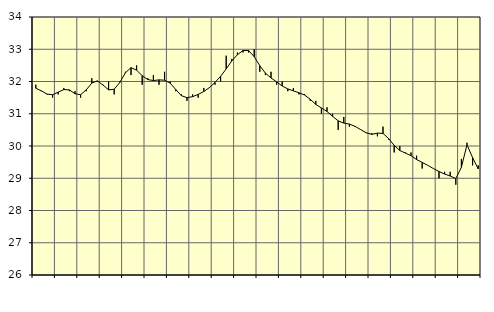
| Category | Piggar | Series 1 |
|---|---|---|
| nan | 31.9 | 31.79 |
| 1.0 | 31.7 | 31.71 |
| 1.0 | 31.6 | 31.61 |
| 1.0 | 31.5 | 31.59 |
| nan | 31.6 | 31.67 |
| 2.0 | 31.8 | 31.75 |
| 2.0 | 31.7 | 31.74 |
| 2.0 | 31.7 | 31.62 |
| nan | 31.5 | 31.59 |
| 3.0 | 31.7 | 31.74 |
| 3.0 | 32.1 | 31.95 |
| 3.0 | 32 | 32.02 |
| nan | 31.9 | 31.89 |
| 4.0 | 32 | 31.74 |
| 4.0 | 31.6 | 31.76 |
| 4.0 | 32 | 31.97 |
| nan | 32.3 | 32.27 |
| 5.0 | 32.2 | 32.43 |
| 5.0 | 32.5 | 32.35 |
| 5.0 | 31.9 | 32.18 |
| nan | 32.1 | 32.06 |
| 6.0 | 32.2 | 32.03 |
| 6.0 | 31.9 | 32.05 |
| 6.0 | 32.3 | 32.04 |
| nan | 32 | 31.95 |
| 7.0 | 31.7 | 31.75 |
| 7.0 | 31.6 | 31.56 |
| 7.0 | 31.4 | 31.5 |
| nan | 31.6 | 31.53 |
| 8.0 | 31.5 | 31.6 |
| 8.0 | 31.8 | 31.69 |
| 8.0 | 31.8 | 31.81 |
| nan | 31.9 | 31.97 |
| 9.0 | 32 | 32.16 |
| 9.0 | 32.8 | 32.39 |
| 9.0 | 32.7 | 32.64 |
| nan | 32.9 | 32.83 |
| 10.0 | 32.9 | 32.96 |
| 10.0 | 32.9 | 32.96 |
| 10.0 | 33 | 32.77 |
| nan | 32.3 | 32.49 |
| 11.0 | 32.2 | 32.26 |
| 11.0 | 32.3 | 32.11 |
| 11.0 | 31.9 | 31.99 |
| nan | 32 | 31.86 |
| 12.0 | 31.7 | 31.77 |
| 12.0 | 31.8 | 31.71 |
| 12.0 | 31.6 | 31.65 |
| nan | 31.6 | 31.58 |
| 13.0 | 31.4 | 31.45 |
| 13.0 | 31.4 | 31.29 |
| 13.0 | 31 | 31.18 |
| nan | 31.2 | 31.07 |
| 14.0 | 31 | 30.92 |
| 14.0 | 30.5 | 30.78 |
| 14.0 | 30.9 | 30.71 |
| nan | 30.6 | 30.68 |
| 15.0 | 30.6 | 30.61 |
| 15.0 | 30.5 | 30.51 |
| 15.0 | 30.4 | 30.41 |
| nan | 30.4 | 30.36 |
| 16.0 | 30.3 | 30.4 |
| 16.0 | 30.6 | 30.39 |
| 16.0 | 30.2 | 30.23 |
| nan | 29.8 | 30.02 |
| 17.0 | 30 | 29.86 |
| 17.0 | 29.8 | 29.78 |
| 17.0 | 29.8 | 29.7 |
| nan | 29.7 | 29.58 |
| 18.0 | 29.3 | 29.49 |
| 18.0 | 29.4 | 29.4 |
| 18.0 | 29.3 | 29.3 |
| nan | 29 | 29.21 |
| 19.0 | 29.2 | 29.13 |
| 19.0 | 29.2 | 29.07 |
| 19.0 | 28.8 | 28.99 |
| nan | 29.6 | 29.34 |
| 20.0 | 30.1 | 30.04 |
| 20.0 | 29.4 | 29.64 |
| 20.0 | 29.4 | 29.29 |